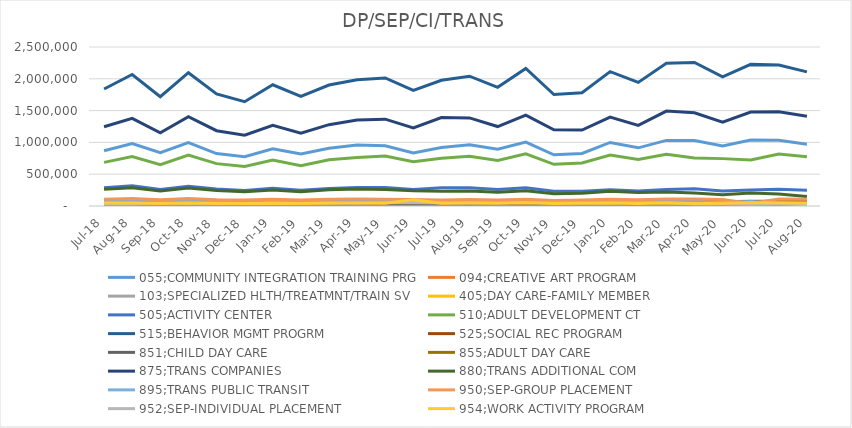
| Category | 055;COMMUNITY INTEGRATION TRAINING PRG | 094;CREATIVE ART PROGRAM | 103;SPECIALIZED HLTH/TREATMNT/TRAIN SV | 405;DAY CARE-FAMILY MEMBER | 505;ACTIVITY CENTER | 510;ADULT DEVELOPMENT CT | 515;BEHAVIOR MGMT PROGRM | 525;SOCIAL REC PROGRAM | 851;CHILD DAY CARE | 855;ADULT DAY CARE | 875;TRANS COMPANIES | 880;TRANS ADDITIONAL COM | 895;TRANS PUBLIC TRANSIT | 950;SEP-GROUP PLACEMENT | 952;SEP-INDIVIDUAL PLACEMENT | 954;WORK ACTIVITY PROGRAM |
|---|---|---|---|---|---|---|---|---|---|---|---|---|---|---|---|---|
| Jul-18 | 869000.37 | 0 | 0 | 29434.62 | 285688.17 | 685827.29 | 1840073.24 | 12560.59 | 6532.28 | 82213.15 | 1245514.66 | 264962.35 | 77206.65 | 104467.7 | 34789.21 | 45502.51 |
| Aug-18 | 980158.74 | 0 | 0 | 25073.3 | 319048.27 | 778831.6 | 2067681.63 | 13232.48 | 5415.12 | 93349.49 | 1378995.98 | 285407.72 | 79350.93 | 119010.06 | 35924.17 | 48299.12 |
| Sep-18 | 837835.09 | 0 | 0 | 22977.59 | 257889.23 | 650018.34 | 1717571.06 | 12342.27 | 4886.04 | 72670.66 | 1151749.77 | 237236.16 | 76710.13 | 97919.16 | 45981.22 | 40417.14 |
| Oct-18 | 995994.01 | 0 | 0 | 30228.91 | 310222.56 | 801521.86 | 2095883.07 | 15755.96 | 2069.23 | 83686.81 | 1403507.03 | 282519.06 | 77503.11 | 118199.81 | 40201.89 | 48101.54 |
| Nov-18 | 824927.47 | 0 | 0 | 26870.91 | 265625.32 | 666002.05 | 1761828.8 | 12951.5 | 2625.04 | 64629.53 | 1183783.23 | 243719.71 | 78111.91 | 97367.31 | 46835.89 | 40561.78 |
| Dec-18 | 774532.57 | 11301.69 | 0 | 28331.9 | 245610.9 | 622382.55 | 1639215.88 | 12743.23 | 2602.34 | 63839.91 | 1114076.52 | 225313.67 | 80442.36 | 93937.77 | 40871.78 | 39724.39 |
| Jan-19 | 898653.19 | 13482.72 | 0 | 30814.84 | 278480.46 | 724155.31 | 1906009.92 | 12634.16 | 3013.44 | 72410.03 | 1267544.09 | 250428.82 | 78751.73 | 104441.73 | 45698.91 | 43835.19 |
| Feb-19 | 817859.41 | 13879.27 | 0 | 26565.63 | 248943.12 | 632106.61 | 1722281.33 | 11455 | 2436.97 | 67725.44 | 1145193.39 | 222502.2 | 79229.24 | 95724.6 | 44652.36 | 37746.32 |
| Mar-19 | 909388.92 | 16294.6 | 0 | 28983.67 | 274554.01 | 727816.23 | 1902214.1 | 14349.61 | 2723.45 | 76043.92 | 1278805.29 | 255719.76 | 73234.7 | 106936.13 | 52785.69 | 43430.46 |
| Apr-19 | 958000.78 | 15789.9 | 0 | 30355.6 | 289930.61 | 762131.16 | 1983955.66 | 17610.95 | 2868.27 | 75935.47 | 1352208.75 | 268374.58 | 74898.25 | 111056.21 | 44021.32 | 46046.45 |
| May-19 | 948286.94 | 15934.1 | 0 | 29110.33 | 290501.17 | 785305.39 | 2013674.42 | 15492.52 | 2844.89 | 77556.73 | 1365501.98 | 259888.89 | 77968.02 | 107960.91 | 53266.21 | 42143.82 |
| Jun-19 | 832458.15 | 24243.66 | 0 | 29570.8 | 258998.28 | 696931.72 | 1816126.56 | 15338.07 | 3325.91 | 70388.39 | 1226691.45 | 238162.03 | 63158.75 | 103286.47 | 50759.06 | 96139.16 |
| Jul-19 | 918294.71 | 31633.89 | 0 | 29390.16 | 288767.45 | 749701.41 | 1976520.95 | 15961.64 | 4178.18 | 76779.11 | 1389986.64 | 233149.56 | 76388.15 | 94683.43 | 48003.83 | 44505.66 |
| Aug-19 | 961247.73 | 26821.22 | 0 | 26192.66 | 285785.63 | 781553.62 | 2041311.17 | 15682.37 | 2766.46 | 77770.64 | 1384627.48 | 236457.18 | 78653.15 | 102589 | 52838.64 | 46644.33 |
| Sep-19 | 891635.28 | 24099.44 | 0 | 24456.44 | 258229.66 | 714577.04 | 1865340.04 | 15007.97 | 2575.1 | 72977.16 | 1249304.53 | 218103.24 | 80430.04 | 92679.77 | 46863.18 | 44288.06 |
| Oct-19 | 1005717.49 | 26767.15 | 0 | 28050.09 | 287593.34 | 820633.3 | 2162461.56 | 10477.65 | 3255.99 | 81173.04 | 1429836.82 | 238759.94 | 79387.72 | 107136.1 | 53825.18 | 52300.51 |
| Nov-19 | 804504.62 | 28155.08 | 0 | 27339.77 | 232173.64 | 655063.63 | 1753406.23 | 12815.8 | 2504.96 | 66089.17 | 1197172.65 | 192832.61 | 81171.75 | 87091.37 | 45925.87 | 41096.79 |
| Dec-19 | 827007.71 | 29957.55 | 0 | 28262.58 | 230538.94 | 675199.85 | 1781082.54 | 12491.94 | 3067.92 | 69587.61 | 1194723.45 | 201818.85 | 76510.75 | 93819.95 | 46589.32 | 41764.66 |
| Jan-20 | 998894.41 | 36123.26 | 0 | 29419.58 | 255933.58 | 800458.36 | 2112269.66 | 13047.48 | 2778.72 | 67951.77 | 1397146.24 | 233297.82 | 79726.25 | 105300.96 | 48999.32 | 46723.55 |
| Feb-20 | 914612.34 | 35011.5 | 0 | 26339.12 | 236965.59 | 730491.16 | 1943429.71 | 15461.73 | 3785.35 | 58446.28 | 1267943.37 | 212776.89 | 76864.75 | 96556.36 | 49544.21 | 40256.64 |
| Mar-20 | 1031317.34 | 27385.02 | 0 | 32678.91 | 259026.6 | 813711.59 | 2244477.46 | 10547.52 | 4328 | 74673 | 1492392.42 | 221011.81 | 80498.25 | 110801.2 | 49888.14 | 47826.54 |
| Apr-20 | 1028263.26 | 36376.82 | 11997.26 | 35425.65 | 270382.93 | 753980.81 | 2256642.93 | 7673.6 | 4383.62 | 76856.26 | 1466461.71 | 205230.38 | 74170.75 | 110065.19 | 34645 | 38963.62 |
| May-20 | 943060.63 | 26975.42 | 15648.6 | 34495.63 | 236000.6 | 744885.6 | 2032113.55 | 7307.36 | 4098.28 | 68728.54 | 1318527.81 | 178341.83 | 55510.25 | 100973.5 | 35716.19 | 44538.99 |
| Jun-20 | 1036890.48 | 42520.91 | 18430.62 | 34262.11 | 251410.37 | 722257.71 | 2226710.11 | 6627.2 | 4200.2 | 76237.25 | 1478517.91 | 203709.63 | 71604.25 | 38851.44 | 32677.47 | 49918.36 |
| Jul-20 | 1034829.79 | 41623.68 | 20430.46 | 34724.98 | 263987.33 | 815776.65 | 2217084.34 | 6958.56 | 4102.14 | 75051.1 | 1481113.46 | 187639.5 | 37667.5 | 109133.63 | 36626.35 | 50072.61 |
| Aug-20 | 969988.69 | 42481.93 | 22125.81 | 29103.82 | 247730.73 | 774995.53 | 2108399.15 | 6993.44 | 4240.95 | 70614.72 | 1411548.01 | 149143.7 | 21607.75 | 105757.58 | 35159.29 | 45374.06 |